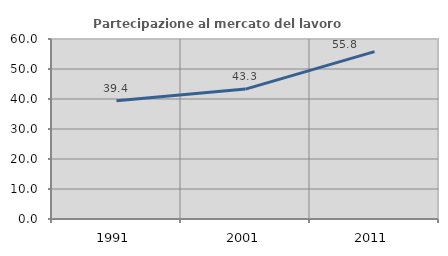
| Category | Partecipazione al mercato del lavoro  femminile |
|---|---|
| 1991.0 | 39.401 |
| 2001.0 | 43.307 |
| 2011.0 | 55.789 |